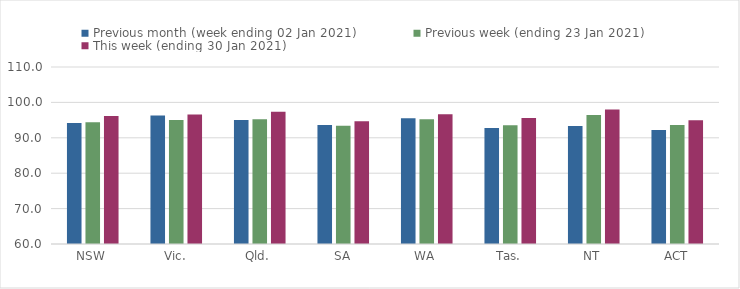
| Category | Previous month (week ending 02 Jan 2021) | Previous week (ending 23 Jan 2021) | This week (ending 30 Jan 2021) |
|---|---|---|---|
| NSW | 94.2 | 94.41 | 96.16 |
| Vic. | 96.27 | 95 | 96.59 |
| Qld. | 95.05 | 95.26 | 97.36 |
| SA | 93.65 | 93.39 | 94.71 |
| WA | 95.51 | 95.21 | 96.63 |
| Tas. | 92.74 | 93.51 | 95.59 |
| NT | 93.34 | 96.46 | 98.01 |
| ACT | 92.18 | 93.63 | 94.98 |